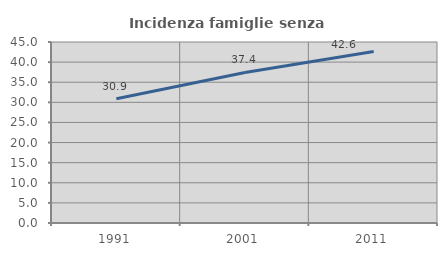
| Category | Incidenza famiglie senza nuclei |
|---|---|
| 1991.0 | 30.902 |
| 2001.0 | 37.422 |
| 2011.0 | 42.642 |